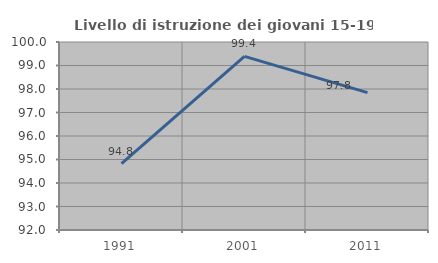
| Category | Livello di istruzione dei giovani 15-19 anni |
|---|---|
| 1991.0 | 94.828 |
| 2001.0 | 99.387 |
| 2011.0 | 97.845 |